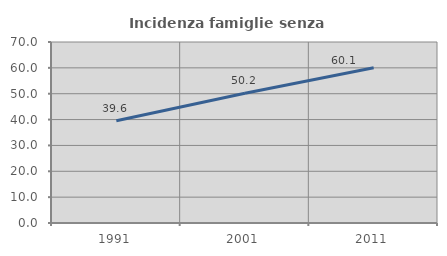
| Category | Incidenza famiglie senza nuclei |
|---|---|
| 1991.0 | 39.574 |
| 2001.0 | 50.198 |
| 2011.0 | 60.072 |